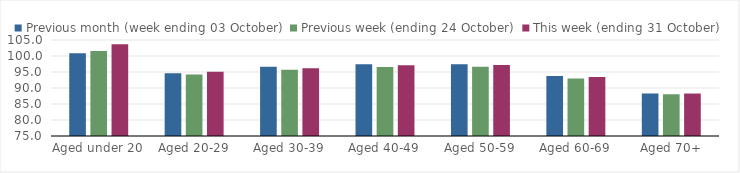
| Category | Previous month (week ending 03 October) | Previous week (ending 24 October) | This week (ending 31 October) |
|---|---|---|---|
| Aged under 20 | 100.84 | 101.53 | 103.71 |
| Aged 20-29 | 94.58 | 94.25 | 95.07 |
| Aged 30-39 | 96.63 | 95.71 | 96.16 |
| Aged 40-49 | 97.43 | 96.59 | 97.13 |
| Aged 50-59 | 97.42 | 96.62 | 97.15 |
| Aged 60-69 | 93.72 | 92.95 | 93.41 |
| Aged 70+ | 88.29 | 88.04 | 88.27 |